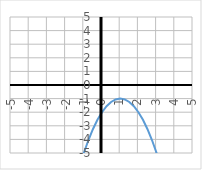
| Category | y |
|---|---|
| -5.0 | -37 |
| -4.75 | -34.062 |
| -4.5 | -31.25 |
| -4.25 | -28.562 |
| -4.0 | -26 |
| -3.75 | -23.562 |
| -3.5 | -21.25 |
| -3.25 | -19.062 |
| -3.0 | -17 |
| -2.75 | -15.062 |
| -2.5 | -13.25 |
| -2.25 | -11.562 |
| -2.0 | -10 |
| -1.75 | -8.562 |
| -1.5 | -7.25 |
| -1.25 | -6.062 |
| -1.0 | -5 |
| -0.75 | -4.062 |
| -0.5 | -3.25 |
| -0.25 | -2.562 |
| 0.0 | -2 |
| 0.25 | -1.562 |
| 0.5 | -1.25 |
| 0.75 | -1.062 |
| 1.0 | -1 |
| 1.25 | -1.062 |
| 1.5 | -1.25 |
| 1.75 | -1.562 |
| 2.0 | -2 |
| 2.25 | -2.562 |
| 2.5 | -3.25 |
| 2.75 | -4.062 |
| 3.0 | -5 |
| 3.25 | -6.062 |
| 3.5 | -7.25 |
| 3.75 | -8.562 |
| 4.0 | -10 |
| 4.25 | -11.562 |
| 4.5 | -13.25 |
| 4.75 | -15.062 |
| 5.0 | -17 |